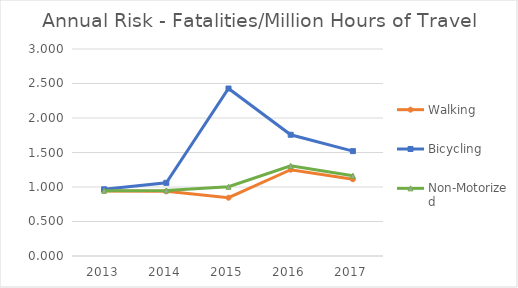
| Category | Walking | Bicycling | Non-Motorized |
|---|---|---|---|
| 2013 | 0.944 | 0.967 | 0.947 |
| 2014 | 0.937 | 1.06 | 0.949 |
| 2015 | 0.844 | 2.427 | 1.003 |
| 2016 | 1.251 | 1.757 | 1.306 |
| 2017 | 1.112 | 1.52 | 1.164 |